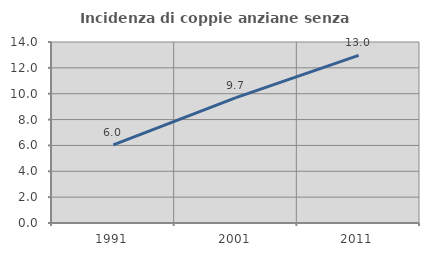
| Category | Incidenza di coppie anziane senza figli  |
|---|---|
| 1991.0 | 6.046 |
| 2001.0 | 9.693 |
| 2011.0 | 12.964 |